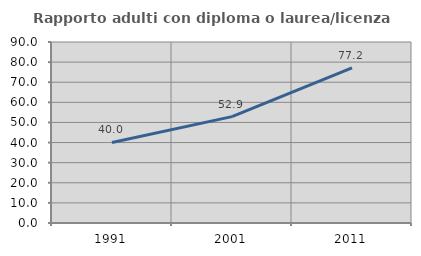
| Category | Rapporto adulti con diploma o laurea/licenza media  |
|---|---|
| 1991.0 | 40.037 |
| 2001.0 | 52.885 |
| 2011.0 | 77.171 |